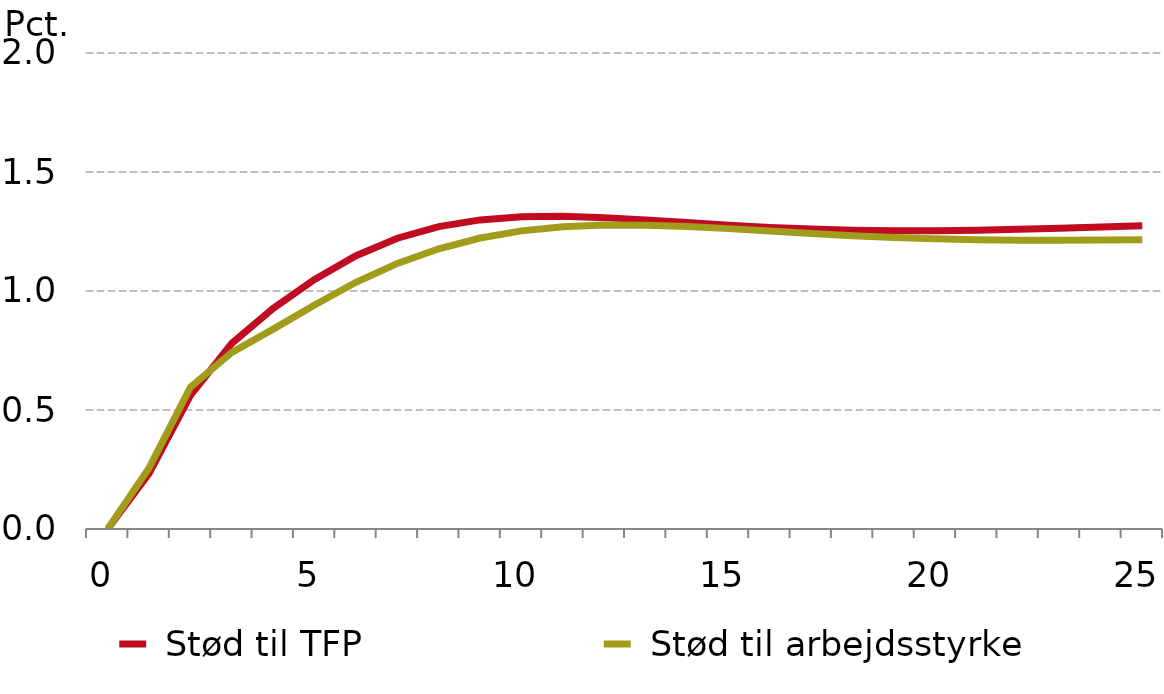
| Category |  Stød til TFP |  Stød til arbejdsstyrke |
|---|---|---|
| 0.0 | 0 | 0 |
| nan | 0.234 | 0.257 |
| nan | 0.561 | 0.596 |
| nan | 0.78 | 0.742 |
| nan | 0.927 | 0.84 |
| 5.0 | 1.049 | 0.941 |
| nan | 1.148 | 1.037 |
| nan | 1.222 | 1.116 |
| nan | 1.27 | 1.178 |
| nan | 1.299 | 1.223 |
| 10.0 | 1.312 | 1.253 |
| nan | 1.314 | 1.27 |
| nan | 1.308 | 1.277 |
| nan | 1.299 | 1.277 |
| nan | 1.287 | 1.271 |
| 15.0 | 1.277 | 1.262 |
| nan | 1.267 | 1.252 |
| nan | 1.26 | 1.242 |
| nan | 1.255 | 1.233 |
| nan | 1.253 | 1.225 |
| 20.0 | 1.254 | 1.219 |
| nan | 1.256 | 1.216 |
| nan | 1.259 | 1.214 |
| nan | 1.264 | 1.213 |
| nan | 1.269 | 1.214 |
| 25.0 | 1.274 | 1.216 |